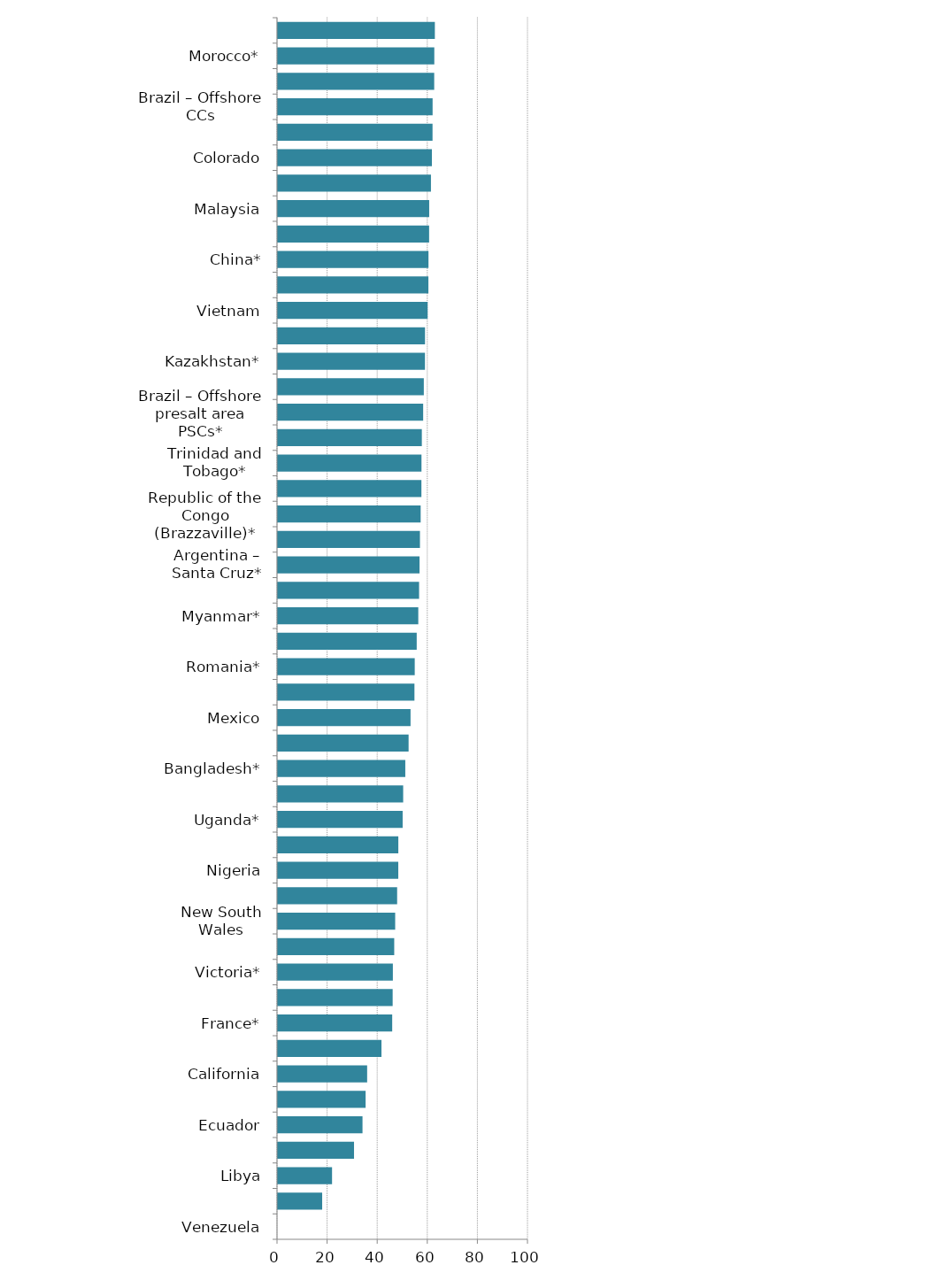
| Category | PPI Score |
|---|---|
| Venezuela | 0 |
| Bolivia* | 17.68 |
| Libya | 21.619 |
| Iraq | 30.393 |
| Ecuador | 33.781 |
| Indonesia | 35.023 |
| California | 35.633 |
| Cambodia* | 41.355 |
| France* | 45.636 |
| Yemen* | 45.819 |
| Victoria* | 45.903 |
| Northern Territory* | 46.447 |
| New South Wales | 46.829 |
| Papua New Guinea* | 47.609 |
| Nigeria | 48.068 |
| Algeria | 48.083 |
| Uganda* | 49.809 |
| Angola | 50.022 |
| Bangladesh* | 50.868 |
| Spain – Onshore | 52.184 |
| Mexico | 52.966 |
| British Columbia | 54.524 |
| Romania* | 54.639 |
| Tanzania* | 55.425 |
| Myanmar* | 56.054 |
| India | 56.373 |
| Argentina – Santa Cruz* | 56.552 |
| Kenya* | 56.719 |
| Republic of the Congo (Brazzaville)* | 57 |
| Michigan* | 57.304 |
| Trinidad and Tobago* | 57.333 |
| Mozambique* | 57.472 |
| Brazil – Offshore presalt area PSCs* | 58 |
| Poland* | 58.261 |
| Kazakhstan* | 58.72 |
| Alaska | 58.743 |
| Vietnam | 59.786 |
| Queensland | 60.093 |
| China* | 60.125 |
| Peru | 60.376 |
| Malaysia | 60.41 |
| Argentina – Mendoza* | 61.109 |
| Colorado | 61.485 |
| Ohio* | 61.743 |
| Brazil – Offshore CCs | 61.768 |
| Gabon | 62.413 |
| Morocco* | 62.45 |
| Spain – Offshore | 62.67 |